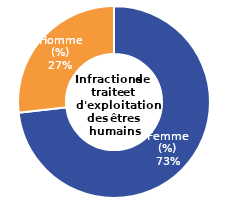
| Category | Infractions de traite et d'exploitation des êtres humains |
|---|---|
| Femme (%) | 72.93 |
| Homme (%) | 26.67 |